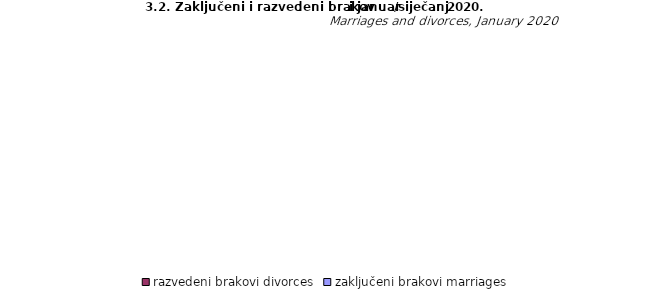
| Category | zaključeni brakovi marriages | razvedeni brakovi divorces |
|---|---|---|
| Unsko - sanski | 78 | 23 |
| Kanton Posavski | 8 | 0 |
| Tuzlanski | 151 | 20 |
| Zeničko - dobojski | 124 | 18 |
| Bosansko - podrinjski | 6 | 4 |
| Srednjobosanski | 60 | 10 |
| Hercegovačko-
neretvanski | 32 | 8 |
| Zapadnohercegovački | 10 | 1 |
| Kanton Sarajevo | 82 | 10 |
| Kanton 10 | 11 | 5 |